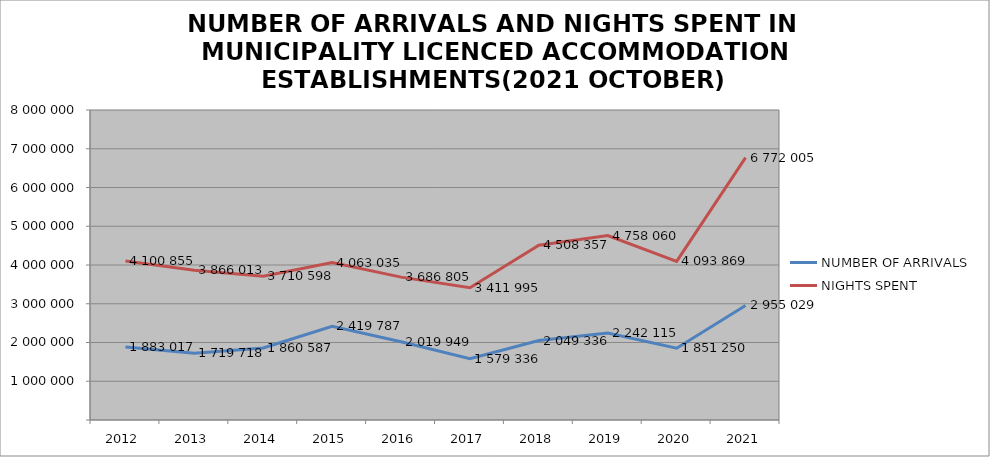
| Category | NUMBER OF ARRIVALS | NIGHTS SPENT |
|---|---|---|
| 2012 | 1883017 | 4100855 |
| 2013 | 1719718 | 3866013 |
| 2014 | 1860587 | 3710598 |
| 2015 | 2419787 | 4063035 |
| 2016 | 2019949 | 3686805 |
| 2017 | 1579336 | 3411995 |
| 2018 | 2049336 | 4508357 |
| 2019 | 2242115 | 4758060 |
| 2020 | 1851250 | 4093869 |
| 2021 | 2955029 | 6772005 |